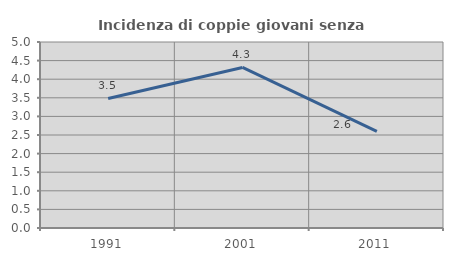
| Category | Incidenza di coppie giovani senza figli |
|---|---|
| 1991.0 | 3.483 |
| 2001.0 | 4.317 |
| 2011.0 | 2.597 |